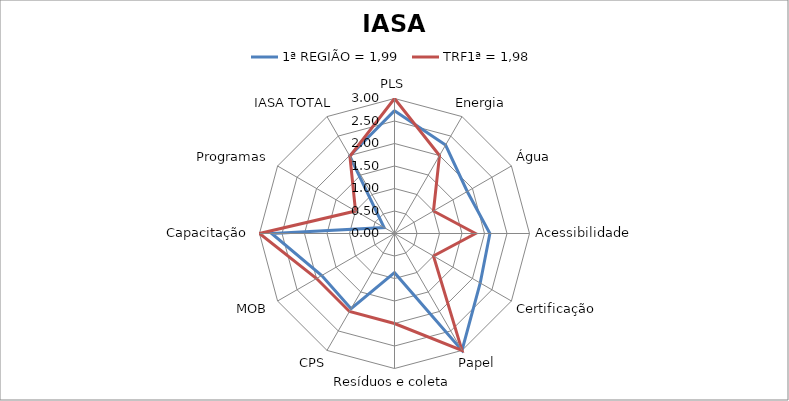
| Category | 1ª REGIÃO = 1,99 | TRF1ª = 1,98 |
|---|---|---|
| PLS | 2.73 | 3 |
| Energia | 2.27 | 2 |
| Água | 1.867 | 1 |
| Acessibilidade | 2.12 | 1.8 |
| Certificação | 2.2 | 1 |
| Papel | 3 | 3 |
| Resíduos e coleta | 0.87 | 2 |
| CPS | 1.93 | 2 |
| MOB | 1.867 | 2 |
| Capacitação | 2.73 | 3 |
| Programas | 0.267 | 1 |
| IASA TOTAL | 1.99 | 1.982 |